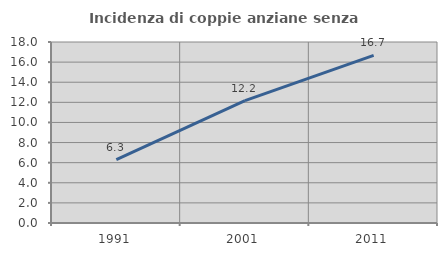
| Category | Incidenza di coppie anziane senza figli  |
|---|---|
| 1991.0 | 6.311 |
| 2001.0 | 12.162 |
| 2011.0 | 16.667 |